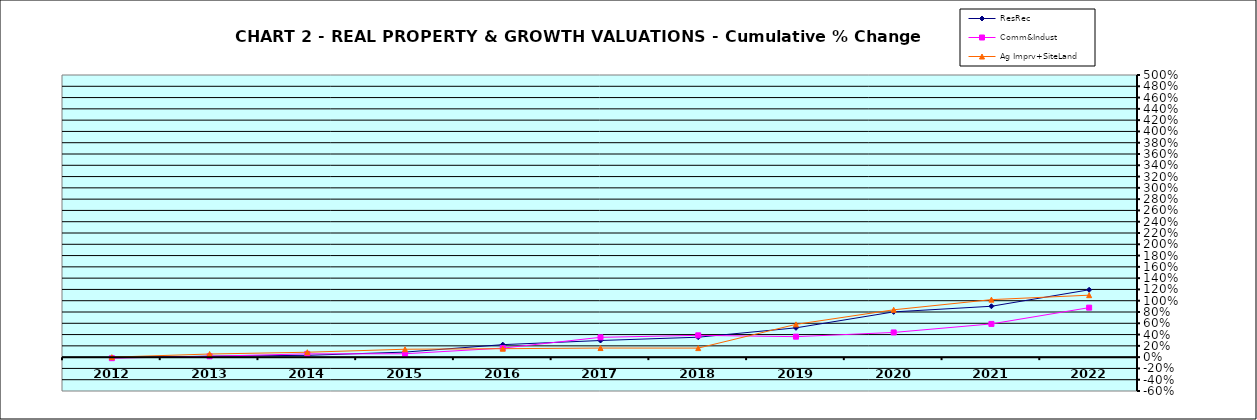
| Category | ResRec | Comm&Indust | Ag Imprv+SiteLand |
|---|---|---|---|
| 2012.0 | -0.011 | -0.018 | 0 |
| 2013.0 | 0.017 | 0.016 | 0.055 |
| 2014.0 | 0.032 | 0.058 | 0.087 |
| 2015.0 | 0.09 | 0.06 | 0.14 |
| 2016.0 | 0.222 | 0.16 | 0.15 |
| 2017.0 | 0.295 | 0.351 | 0.161 |
| 2018.0 | 0.353 | 0.386 | 0.16 |
| 2019.0 | 0.519 | 0.363 | 0.581 |
| 2020.0 | 0.802 | 0.438 | 0.839 |
| 2021.0 | 0.902 | 0.589 | 1.019 |
| 2022.0 | 1.194 | 0.877 | 1.098 |